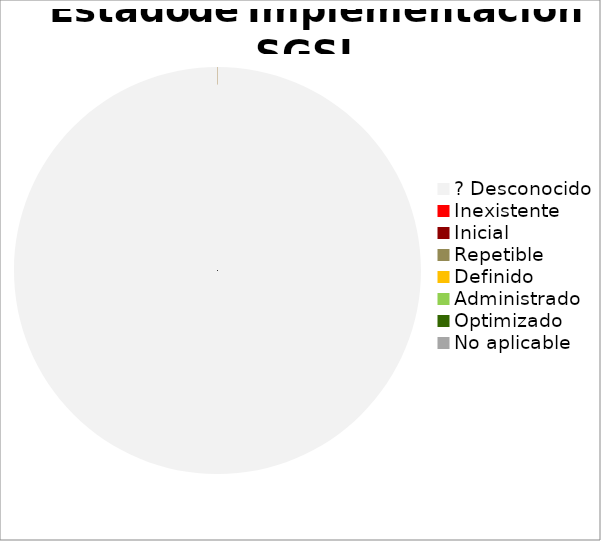
| Category | Series 0 |
|---|---|
| ? Desconocido | 1 |
| Inexistente | 0 |
| Inicial | 0 |
| Repetible | 0 |
| Definido | 0 |
| Administrado | 0 |
| Optimizado | 0 |
| No aplicable | 0 |